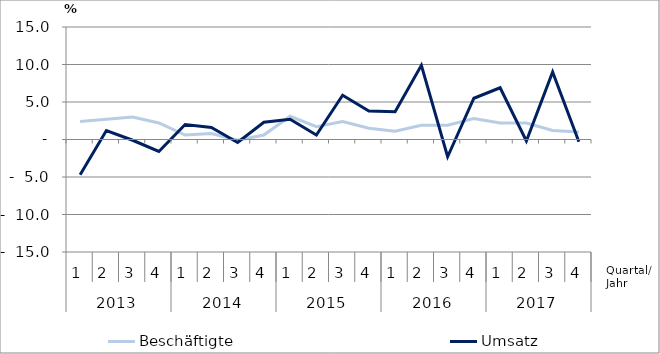
| Category | Beschäftigte | Umsatz |
|---|---|---|
| 0 | 2.4 | -4.7 |
| 1 | 2.7 | 1.2 |
| 2 | 3 | -0.1 |
| 3 | 2.2 | -1.6 |
| 4 | 0.6 | 2 |
| 5 | 0.8 | 1.6 |
| 6 | -0.1 | -0.4 |
| 7 | 0.6 | 2.3 |
| 8 | 3.1 | 2.7 |
| 9 | 1.7 | 0.6 |
| 10 | 2.4 | 5.9 |
| 11 | 1.5 | 3.8 |
| 12 | 1.1 | 3.7 |
| 13 | 1.9 | 9.9 |
| 14 | 1.9 | -2.3 |
| 15 | 2.8 | 5.5 |
| 16 | 2.2 | 6.9 |
| 17 | 2.2 | -0.2 |
| 18 | 1.2 | 9 |
| 19 | 1 | -0.3 |